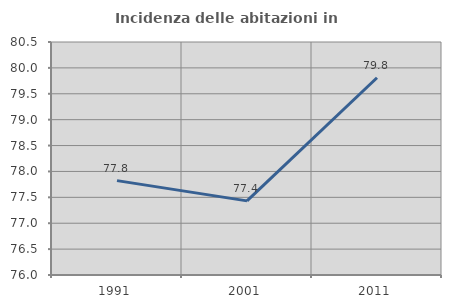
| Category | Incidenza delle abitazioni in proprietà  |
|---|---|
| 1991.0 | 77.823 |
| 2001.0 | 77.432 |
| 2011.0 | 79.81 |